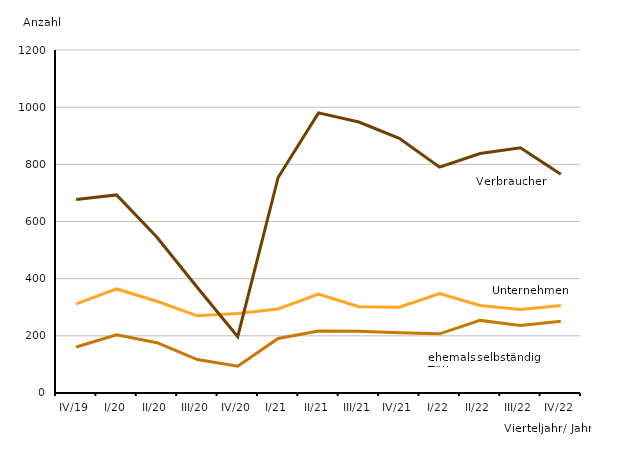
| Category | Series 0 | Series 1 | Series 2 |
|---|---|---|---|
| IV/19 | 312 | 677 | 161 |
| I/20 | 364 | 693 | 204 |
| II/20 | 321 | 545 | 176 |
| III/20 | 270 | 369 | 117 |
| IV/20 | 278 | 197 | 94 |
| I/21 | 294 | 754 | 191 |
| II/21 | 346 | 980 | 217 |
| III/21 | 302 | 948 | 216 |
| IV/21 | 300 | 891 | 211 |
| I/22 | 348 | 790 | 207 |
| II/22 | 306 | 838 | 254 |
| III/22 | 292 | 858 | 236 |
| IV/22 | 306 | 765 | 251 |